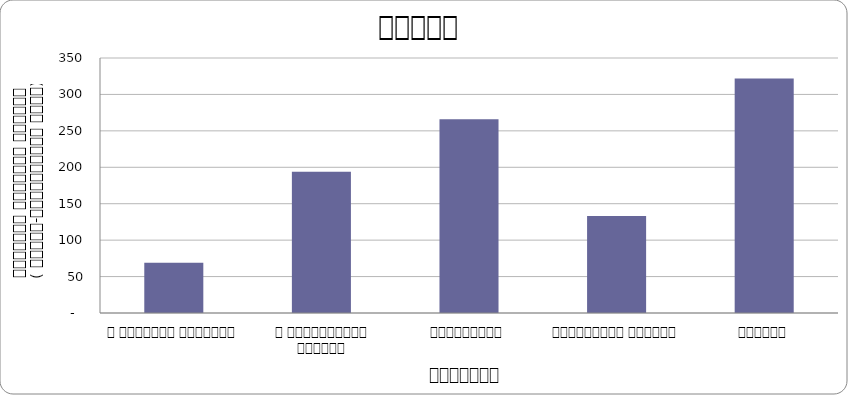
| Category | Series 0 |
|---|---|
| द हिमालयन टाइम्स् | 69 |
| द काठमाण्डौं पोस्ट् | 194 |
| कान्तिपुर | 266 |
| अन्नपूर्ण पोस्ट् | 133 |
| नागरिक | 322 |